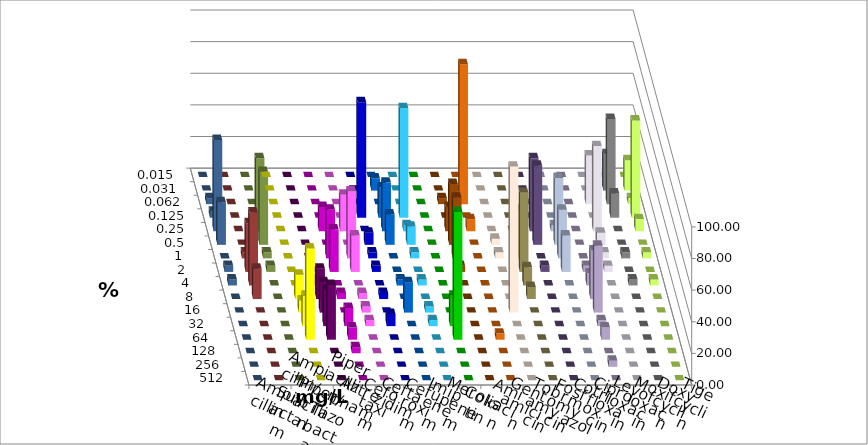
| Category | Ampicillin | Ampicillin/ Sulbactam | Piperacillin | Piperacillin/ Tazobactam | Aztreonam | Cefotaxim | Ceftazidim | Cefuroxim | Imipenem | Meropenem | Colistin | Amikacin | Gentamicin | Tobramycin | Fosfomycin | Cotrimoxazol | Ciprofloxacin | Levofloxacin | Moxifloxacin | Doxycyclin | Tigecyclin |
|---|---|---|---|---|---|---|---|---|---|---|---|---|---|---|---|---|---|---|---|---|---|
| 0.015 | 0 | 0 | 0 | 0 | 0 | 0 | 0 | 0 | 0 | 0 | 0 | 0 | 0 | 0 | 0 | 0 | 0 | 0 | 0 | 0 | 0 |
| 0.031 | 0 | 0 | 0 | 0 | 0 | 7.692 | 0 | 0 | 0 | 0 | 0 | 0 | 0 | 0 | 0 | 0 | 23.077 | 19.231 | 0 | 0 | 0 |
| 0.062 | 0 | 0 | 0 | 0 | 0 | 0 | 0 | 0 | 3.846 | 88.462 | 0 | 0 | 0 | 0 | 0 | 30.769 | 53.846 | 3.846 | 3.846 | 0 | 0 |
| 0.125 | 0 | 0 | 0 | 0 | 73.077 | 19.231 | 69.231 | 0 | 0 | 0 | 0 | 0 | 0 | 0 | 0 | 0 | 15.385 | 61.538 | 3.846 | 0 | 0 |
| 0.25 | 0 | 0 | 15.385 | 23.077 | 0 | 30.769 | 3.846 | 0 | 15.385 | 7.692 | 0 | 0 | 46.154 | 3.846 | 0 | 53.846 | 0 | 7.692 | 57.692 | 0 | 46.154 |
| 0.5 | 0 | 0 | 0 | 0 | 7.692 | 19.231 | 11.538 | 0 | 38.462 | 0 | 3.846 | 0 | 50 | 42.308 | 0 | 7.692 | 0 | 0 | 26.923 | 0 | 46.154 |
| 1.0 | 0 | 0 | 30.769 | 42.308 | 3.846 | 0 | 3.846 | 0 | 38.462 | 0 | 3.846 | 30.769 | 0 | 30.769 | 0 | 3.846 | 3.846 | 3.846 | 0 | 3.846 | 3.846 |
| 2.0 | 0 | 0 | 26.923 | 23.077 | 3.846 | 0 | 0 | 0 | 3.846 | 0 | 0 | 50 | 3.846 | 23.077 | 3.846 | 3.846 | 0 | 0 | 3.846 | 30.769 | 3.846 |
| 4.0 | 0 | 3.846 | 0 | 0 | 0 | 3.846 | 3.846 | 0 | 0 | 0 | 0 | 11.538 | 0 | 0 | 7.692 | 0 | 3.846 | 3.846 | 3.846 | 46.154 | 0 |
| 8.0 | 15.385 | 19.231 | 3.846 | 3.846 | 3.846 | 0 | 0 | 0 | 0 | 0 | 0 | 7.692 | 0 | 0 | 30.769 | 0 | 0 | 0 | 0 | 19.231 | 0 |
| 16.0 | 7.692 | 19.231 | 0 | 3.846 | 0 | 19.231 | 3.846 | 0 | 0 | 0 | 92.308 | 0 | 0 | 0 | 42.308 | 0 | 0 | 0 | 0 | 0 | 0 |
| 32.0 | 19.231 | 23.077 | 11.538 | 3.846 | 7.692 | 0 | 3.846 | 19.231 | 0 | 0 | 0 | 0 | 0 | 0 | 3.846 | 0 | 0 | 0 | 0 | 0 | 0 |
| 64.0 | 57.692 | 34.615 | 7.692 | 0 | 0 | 0 | 0 | 80.769 | 0 | 3.846 | 0 | 0 | 0 | 0 | 7.692 | 0 | 0 | 0 | 0 | 0 | 0 |
| 128.0 | 0 | 0 | 3.846 | 0 | 0 | 0 | 0 | 0 | 0 | 0 | 0 | 0 | 0 | 0 | 0 | 0 | 0 | 0 | 0 | 0 | 0 |
| 256.0 | 0 | 0 | 0 | 0 | 0 | 0 | 0 | 0 | 0 | 0 | 0 | 0 | 0 | 0 | 3.846 | 0 | 0 | 0 | 0 | 0 | 0 |
| 512.0 | 0 | 0 | 0 | 0 | 0 | 0 | 0 | 0 | 0 | 0 | 0 | 0 | 0 | 0 | 0 | 0 | 0 | 0 | 0 | 0 | 0 |